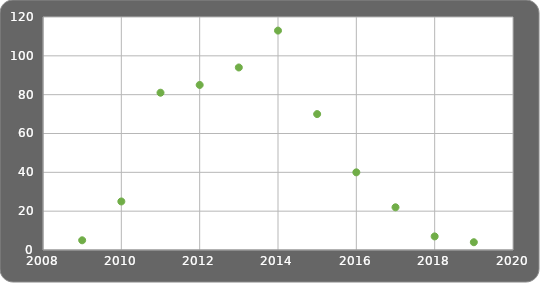
| Category | Number of Sunspots visible  |
|---|---|
| 2009.0 | 5 |
| 2010.0 | 25 |
| 2011.0 | 81 |
| 2012.0 | 85 |
| 2013.0 | 94 |
| 2014.0 | 113 |
| 2015.0 | 70 |
| 2016.0 | 40 |
| 2017.0 | 22 |
| 2018.0 | 7 |
| 2019.0 | 4 |